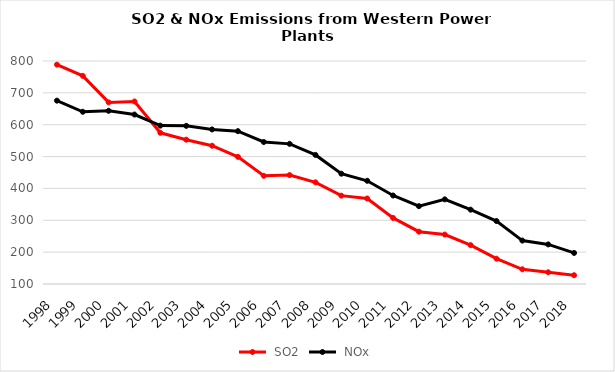
| Category |  SO2 |  NOx |
|---|---|---|
| 1998.0 | 788504.571 | 675531.733 |
| 1999.0 | 753387.743 | 640643.542 |
| 2000.0 | 670032.119 | 643642.12 |
| 2001.0 | 673013.758 | 631942.469 |
| 2002.0 | 574594.635 | 597152.435 |
| 2003.0 | 553032.658 | 596376.155 |
| 2004.0 | 534034.749 | 585156.871 |
| 2005.0 | 499191.101 | 579817.625 |
| 2006.0 | 439638.936 | 545741.955 |
| 2007.0 | 441869.359 | 539896.932 |
| 2008.0 | 419167.724 | 505184.071 |
| 2009.0 | 377292.181 | 446251.233 |
| 2010.0 | 368380.758 | 424016.618 |
| 2011.0 | 307361.309 | 377769.538 |
| 2012.0 | 264224.584 | 344345.615 |
| 2013.0 | 255195.245 | 365708.118 |
| 2014.0 | 221995.961 | 333323.225 |
| 2015.0 | 179418.974 | 297689.037 |
| 2016.0 | 146194.65 | 236283.035 |
| 2017.0 | 136843.509 | 224302.003 |
| 2018.0 | 127547.746 | 197505.954 |